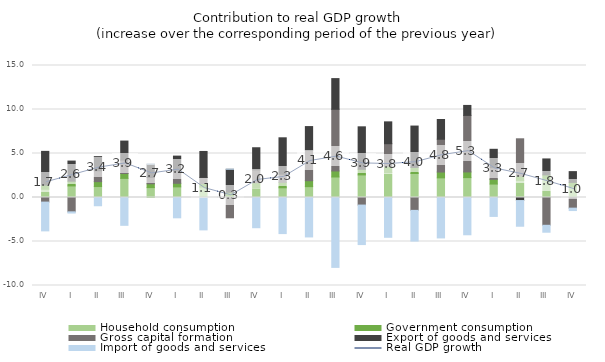
| Category | Household consumption | Government consumption | Gross capital formation | Export of goods and services | Import of goods and services |
|---|---|---|---|---|---|
| IV | 0.942 | 0.471 | -0.522 | 3.828 | -3.27 |
| I | 1.316 | 0.534 | -1.63 | 2.289 | -0.137 |
| II | 1.246 | 0.556 | 1.239 | 1.604 | -0.938 |
| III | 2.174 | 0.555 | 1.531 | 2.152 | -3.163 |
| IV | 1.125 | 0.436 | 0.714 | 1.508 | 0.026 |
| I | 1.207 | 0.407 | 1.41 | 1.68 | -2.307 |
| II | 1.183 | 0.401 | 0.699 | 2.95 | -3.68 |
| III | 0.131 | 0.464 | -2.305 | 2.612 | 0.008 |
| IV | 1.059 | 0.617 | 1.461 | 2.518 | -3.434 |
| I | 1.105 | 0.615 | 0.93 | 4.133 | -4.101 |
| II | 1.233 | 0.675 | 3.448 | 2.704 | -4.481 |
| III | 2.331 | 0.685 | 7.009 | 3.486 | -7.942 |
| IV | 2.567 | 0.637 | -0.859 | 4.827 | -4.49 |
| I | 2.83 | 0.711 | 2.573 | 2.482 | -4.522 |
| II | 2.727 | 0.694 | -1.462 | 4.697 | -3.489 |
| III | 2.233 | 0.661 | 3.728 | 2.244 | -4.594 |
| IV | 2.259 | 0.645 | 6.425 | 1.133 | -4.235 |
| I | 1.527 | 0.537 | 1.32 | 2.093 | -2.151 |
| II | 1.941 | 0.497 | 4.234 | -0.346 | -2.919 |
| III | 2.067 | 0.498 | -3.158 | 1.818 | -0.788 |
| IV | 1.231 | 0.485 | -1.211 | 1.225 | -0.272 |